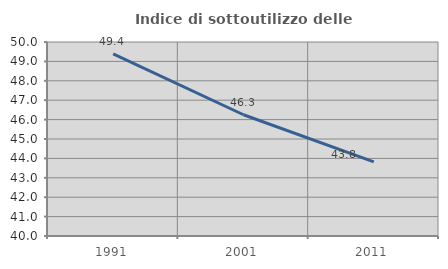
| Category | Indice di sottoutilizzo delle abitazioni  |
|---|---|
| 1991.0 | 49.388 |
| 2001.0 | 46.25 |
| 2011.0 | 43.825 |